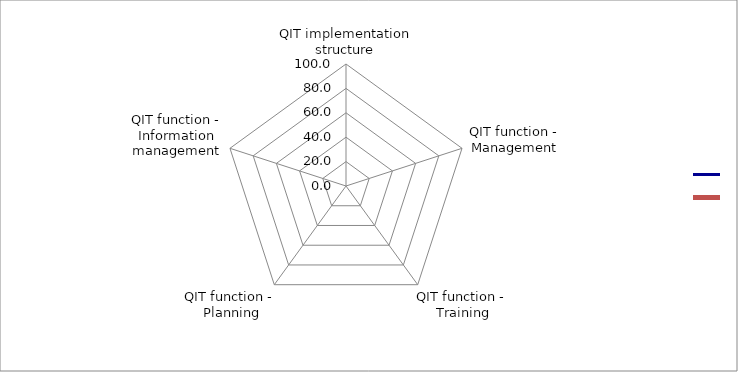
| Category | Series 0 | Series 1 |
|---|---|---|
| QIT implementation structure | 0 |  |
| QIT function - Management | 0 |  |
| QIT function - 
Training | 0 |  |
| QIT function -
 Planning | 0 |  |
| QIT function - Information management | 0 |  |